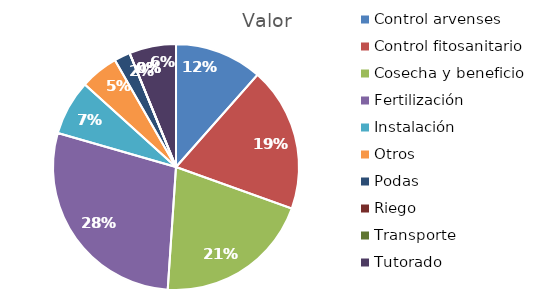
| Category | Valor |
|---|---|
| Control arvenses | 4884587 |
| Control fitosanitario | 8049249 |
| Cosecha y beneficio | 8736000 |
| Fertilización | 12039475 |
| Instalación | 3076667 |
| Otros | 2132707 |
| Podas | 894361 |
| Riego | 0 |
| Transporte | 0 |
| Tutorado | 2614286 |